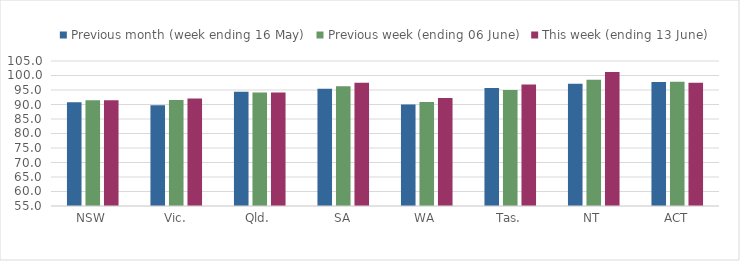
| Category | Previous month (week ending 16 May) | Previous week (ending 06 June) | This week (ending 13 June) |
|---|---|---|---|
| NSW | 90.787 | 91.508 | 91.461 |
| Vic. | 89.755 | 91.581 | 92.094 |
| Qld. | 94.405 | 94.107 | 94.164 |
| SA | 95.441 | 96.284 | 97.524 |
| WA | 89.975 | 90.865 | 92.228 |
| Tas. | 95.664 | 94.967 | 96.906 |
| NT | 97.17 | 98.55 | 101.17 |
| ACT | 97.736 | 97.819 | 97.509 |